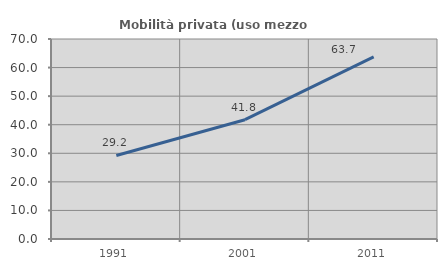
| Category | Mobilità privata (uso mezzo privato) |
|---|---|
| 1991.0 | 29.227 |
| 2001.0 | 41.75 |
| 2011.0 | 63.725 |